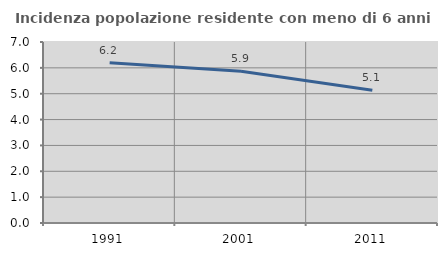
| Category | Incidenza popolazione residente con meno di 6 anni |
|---|---|
| 1991.0 | 6.196 |
| 2001.0 | 5.866 |
| 2011.0 | 5.133 |